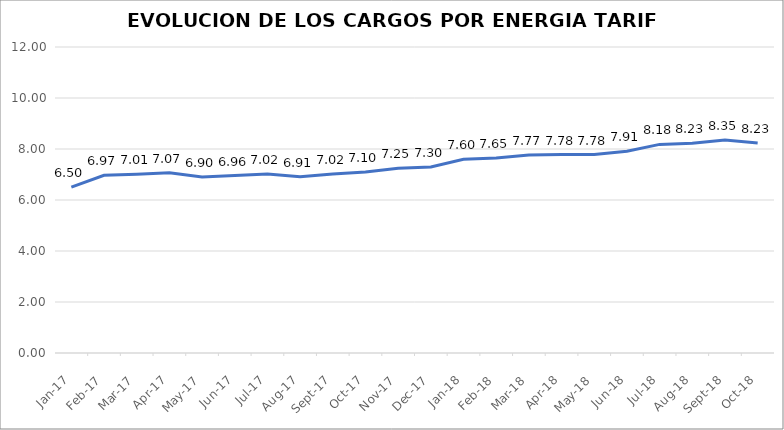
| Category | Series 0 |
|---|---|
| 2017-01-01 | 6.502 |
| 2017-02-01 | 6.97 |
| 2017-03-01 | 7.012 |
| 2017-04-01 | 7.07 |
| 2017-05-01 | 6.9 |
| 2017-06-01 | 6.959 |
| 2017-07-01 | 7.021 |
| 2017-08-01 | 6.914 |
| 2017-09-01 | 7.021 |
| 2017-10-01 | 7.101 |
| 2017-11-01 | 7.249 |
| 2017-12-01 | 7.298 |
| 2018-01-01 | 7.597 |
| 2018-02-01 | 7.65 |
| 2018-03-01 | 7.766 |
| 2018-04-01 | 7.782 |
| 2018-05-01 | 7.78 |
| 2018-06-01 | 7.912 |
| 2018-07-01 | 8.181 |
| 2018-08-01 | 8.226 |
| 2018-09-01 | 8.355 |
| 2018-10-01 | 8.234 |